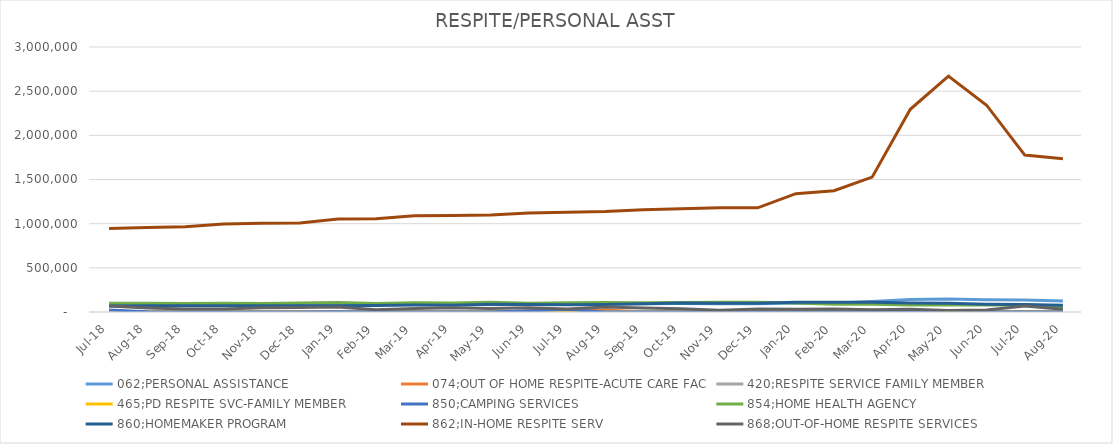
| Category | 062;PERSONAL ASSISTANCE | 074;OUT OF HOME RESPITE-ACUTE CARE FAC | 420;RESPITE SERVICE FAMILY MEMBER | 465;PD RESPITE SVC-FAMILY MEMBER | 850;CAMPING SERVICES | 854;HOME HEALTH AGENCY | 860;HOMEMAKER PROGRAM | 862;IN-HOME RESPITE SERV | 868;OUT-OF-HOME RESPITE SERVICES |
|---|---|---|---|---|---|---|---|---|---|
| Jul-18 | 83013.49 | 3250.3 | 304.6 | 0 | 23095.2 | 98421.26 | 68577.16 | 944324.12 | 67018.91 |
| Aug-18 | 78889.97 | 0 | 304.6 | 0 | 2757.24 | 100339.32 | 69562.37 | 956693.95 | 45932.65 |
| Sep-18 | 76390.35 | 0 | 304.6 | 0 | 0 | 94883.68 | 71013.63 | 965623.5 | 33252.76 |
| Oct-18 | 84577.32 | 0 | 304.6 | 0 | 264.24 | 99756.84 | 70240.4 | 995913.94 | 34575.49 |
| Nov-18 | 85014.3 | 1300.12 | 304.6 | 0 | 1296.36 | 94894.04 | 69706.44 | 1005901.79 | 48350.55 |
| Dec-18 | 84351.81 | 1950.18 | 304.6 | 0 | 132.12 | 101322.48 | 70210.85 | 1007962.2 | 49843.41 |
| Jan-19 | 87701.14 | 1300.12 | 314.8 | 0 | 1446.36 | 106510.05 | 70192.6 | 1051607.12 | 55264.18 |
| Feb-19 | 83313.62 | 650.06 | 314.8 | 0 | 264.24 | 96564.96 | 74884.06 | 1056020.67 | 25983.13 |
| Mar-19 | 87371.8 | 2600.24 | 314.8 | 0 | 264.24 | 103565.59 | 79876.66 | 1089316.02 | 39981.89 |
| Apr-19 | 85989.54 | 0 | 1857.32 | 0 | 264.24 | 101969.12 | 77811.15 | 1093811.07 | 47832.7 |
| May-19 | 88019.59 | 2600.24 | 1857.32 | 0 | 0 | 109877.85 | 86622.59 | 1099488.62 | 41036.6 |
| Jun-19 | 87080.37 | 5850.54 | 1857.32 | 0 | 13300 | 99011.2 | 84759.06 | 1121776.32 | 48003.28 |
| Jul-19 | 91886.01 | 7150.66 | 2361 | 0 | 29209.06 | 103921.9 | 82428.41 | 1129501.49 | 35132.17 |
| Aug-19 | 94675.28 | 21451.98 | 2361 | 0 | 1294.84 | 108620.21 | 85455.68 | 1136893.75 | 55319.28 |
| Sep-19 | 93475.01 | 0 | 2361 | 0 | 0 | 104714.28 | 92062.95 | 1157083.68 | 44697.36 |
| Oct-19 | 97441.88 | 0 | 2833.2 | 0 | 0 | 108107.21 | 102681.11 | 1168290.66 | 36874.84 |
| Nov-19 | 92484.95 | 1950.18 | 2833.2 | 0 | 0 | 110347.49 | 97799.1 | 1179658.62 | 20298.39 |
| Dec-19 | 93162.16 | 0 | 8877.36 | 0 | 0 | 109227 | 98665.87 | 1178930.47 | 35009.75 |
| Jan-20 | 102440.93 | 2600.24 | 5109 | 0 | 0 | 102609.43 | 110893.33 | 1339177.25 | 31660.07 |
| Feb-20 | 100283.11 | 1300.12 | 3065.4 | 0 | 0 | 89120.44 | 109226.62 | 1373657.39 | 32822.28 |
| Mar-20 | 118948.45 | 5850.54 | 3814.72 | 0 | 0 | 88074.29 | 110718.83 | 1526946.57 | 24309.65 |
| Apr-20 | 141527.78 | 650.06 | 3814.72 | 0 | 0 | 80411.25 | 102460.92 | 2294636.4 | 29736.97 |
| May-20 | 148054.88 | 3250.3 | 3814.72 | 0 | 0 | 79605.75 | 99707.72 | 2670280.7 | 17604.08 |
| Jun-20 | 138331.82 | 5200.48 | 3440.06 | 0 | 0 | 79555.84 | 88962.46 | 2341034.68 | 22826.36 |
| Jul-20 | 136844.27 | 3250.3 | 3440.06 | 0 | 0 | 81952.99 | 84010.56 | 1776086.93 | 68528.43 |
| Aug-20 | 124023.3 | 2600.24 | 3440.06 | 0 | 0 | 60614 | 76740.68 | 1735477.4 | 31064.73 |